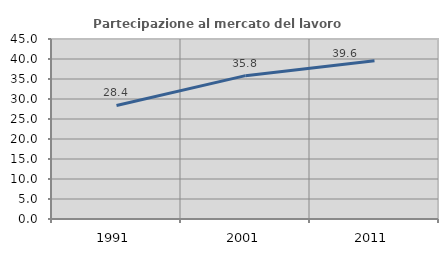
| Category | Partecipazione al mercato del lavoro  femminile |
|---|---|
| 1991.0 | 28.378 |
| 2001.0 | 35.841 |
| 2011.0 | 39.568 |